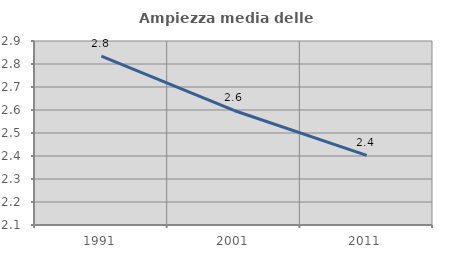
| Category | Ampiezza media delle famiglie |
|---|---|
| 1991.0 | 2.835 |
| 2001.0 | 2.598 |
| 2011.0 | 2.402 |